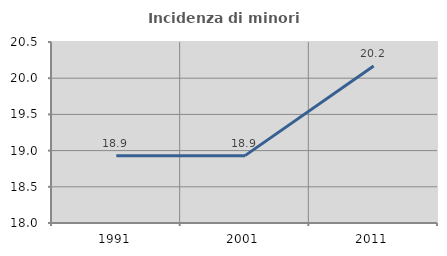
| Category | Incidenza di minori stranieri |
|---|---|
| 1991.0 | 18.93 |
| 2001.0 | 18.93 |
| 2011.0 | 20.17 |